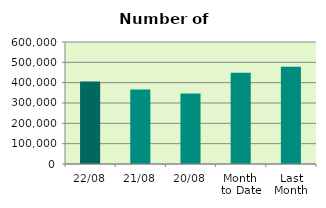
| Category | Series 0 |
|---|---|
| 22/08 | 405150 |
| 21/08 | 366950 |
| 20/08 | 346882 |
| Month 
to Date | 449313.25 |
| Last
Month | 477777.545 |